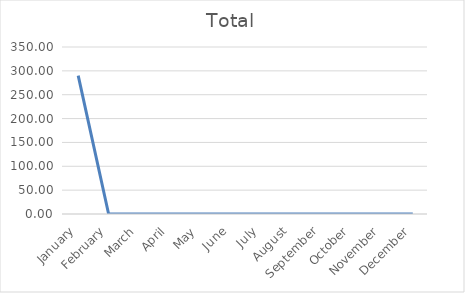
| Category | Total |
|---|---|
| January | 290 |
| February | 0 |
| March | 0 |
| April | 0 |
| May | 0 |
| June | 0 |
| July | 0 |
| August | 0 |
| September | 0 |
| October | 0 |
| November | 0 |
| December | 0 |